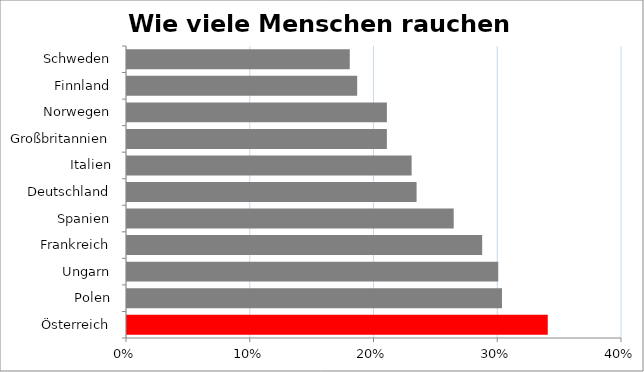
| Category | %-Anteil |
|---|---|
| Österreich | 0.34 |
| Polen | 0.303 |
| Ungarn | 0.3 |
| Frankreich | 0.287 |
| Spanien | 0.264 |
| Deutschland | 0.234 |
| Italien | 0.23 |
| Großbritannien | 0.21 |
| Norwegen | 0.21 |
| Finnland | 0.186 |
| Schweden | 0.18 |